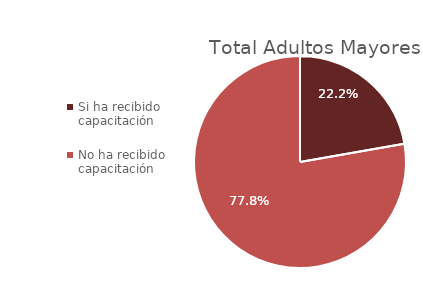
| Category | Series 0 |
|---|---|
| Si ha recibido capacitación  | 0.222 |
| No ha recibido capacitación  | 0.778 |